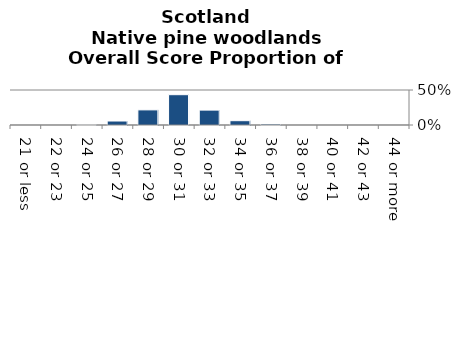
| Category | Native pine woodlands |
|---|---|
| 21 or less | 0 |
| 22 or 23 | 0 |
| 24 or 25 | 0.006 |
| 26 or 27 | 0.057 |
| 28 or 29 | 0.216 |
| 30 or 31 | 0.433 |
| 32 or 33 | 0.213 |
| 34 or 35 | 0.061 |
| 36 or 37 | 0.014 |
| 38 or 39 | 0 |
| 40 or 41 | 0 |
| 42 or 43 | 0 |
| 44 or more | 0 |